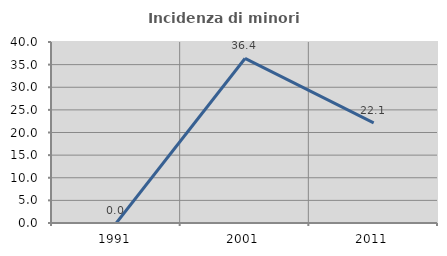
| Category | Incidenza di minori stranieri |
|---|---|
| 1991.0 | 0 |
| 2001.0 | 36.364 |
| 2011.0 | 22.124 |